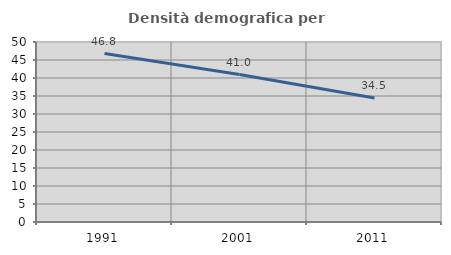
| Category | Densità demografica |
|---|---|
| 1991.0 | 46.78 |
| 2001.0 | 40.958 |
| 2011.0 | 34.459 |